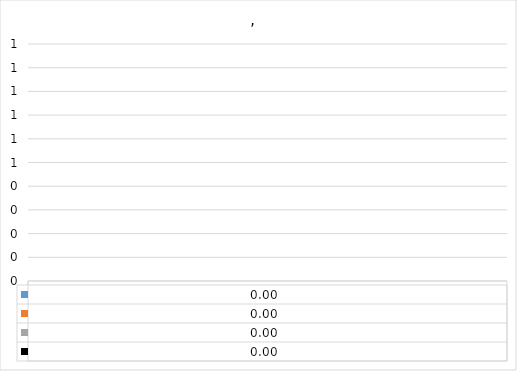
| Category | Series 0 | Series 1 | Series 2 | Series 3 |
|---|---|---|---|---|
| 0 | 0 | 0 | 0 | 0 |